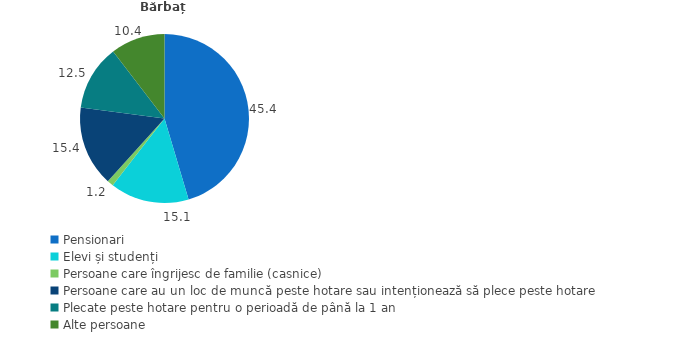
| Category | Bărbați |
|---|---|
| Pensionari | 45.4 |
| Elevi și studenți | 15.1 |
| Persoane care îngrijesc de familie (casnice) | 1.2 |
| Persoane care au un loc de muncă peste hotare sau intenționează să plece peste hotare | 15.4 |
| Plecate peste hotare pentru o perioadă de până la 1 an | 12.5 |
| Alte persoane | 10.4 |